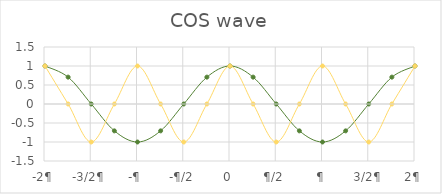
| Category | Series 1 | 1 |
|---|---|---|
| -2¶ | 1 | 1 |
|  | 0.707 | 0 |
| -3/2¶ | 0 | -1 |
|  | -0.707 | 0 |
| -¶ | -1 | 1 |
|  | -0.707 | 0 |
| -¶/2 | 0 | -1 |
|  | 0.707 | 0 |
| 0 | 1 | 1 |
|  | 0.707 | 0 |
| ¶/2 | 0 | -1 |
|  | -0.707 | 0 |
| ¶ | -1 | 1 |
|  | -0.707 | 0 |
| 3/2¶ | 0 | -1 |
|  | 0.707 | 0 |
| 2¶ | 1 | 1 |